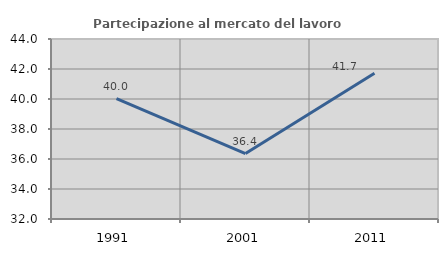
| Category | Partecipazione al mercato del lavoro  femminile |
|---|---|
| 1991.0 | 40.026 |
| 2001.0 | 36.364 |
| 2011.0 | 41.72 |